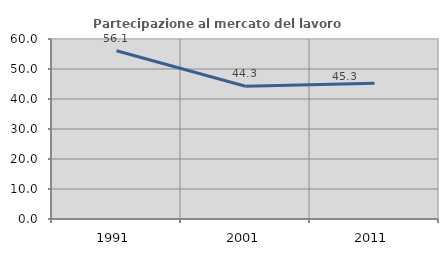
| Category | Partecipazione al mercato del lavoro  femminile |
|---|---|
| 1991.0 | 56.08 |
| 2001.0 | 44.262 |
| 2011.0 | 45.286 |